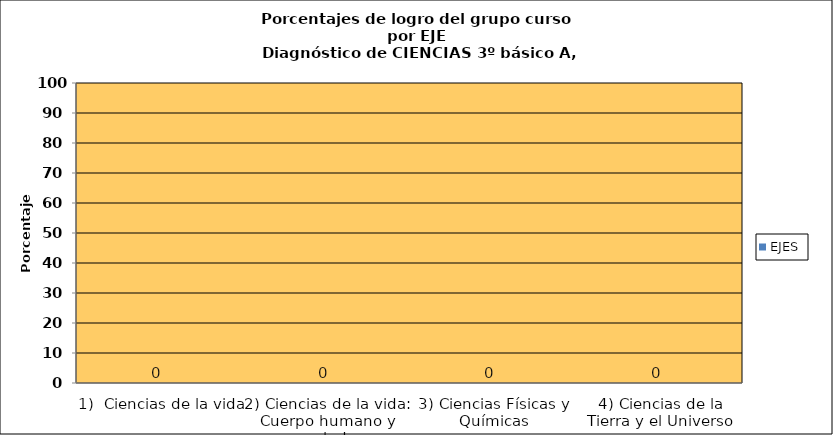
| Category | EJES |
|---|---|
| 1)  Ciencias de la vida | 0 |
| 2) Ciencias de la vida: Cuerpo humano y salud | 0 |
| 3) Ciencias Físicas y Químicas | 0 |
| 4) Ciencias de la Tierra y el Universo | 0 |